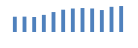
| Category | Exportações (1) |
|---|---|
| 0 | 203692.629 |
| 1 | 204985.899 |
| 2 | 199789.293 |
| 3 | 228223.553 |
| 4 | 265930.688 |
| 5 | 297441.741 |
| 6 | 313195.508 |
| 7 | 319331.634 |
| 8 | 313646.514 |
| 9 | 292708.824 |
| 10 | 335676.548 |
| 11 | 346245.014 |